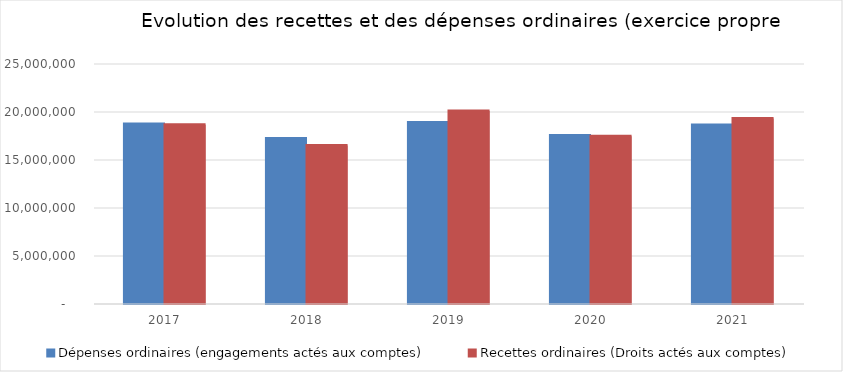
| Category | Dépenses ordinaires (engagements actés aux comptes) | Recettes ordinaires (Droits actés aux comptes) |
|---|---|---|
| 2017.0 | 18752855.6 | 18684102.08 |
| 2018.0 | 17250242.96 | 16512373.5 |
| 2019.0 | 18918446.98 | 20104837.39 |
| 2020.0 | 17554108.51 | 17469001.07 |
| 2021.0 | 18638783.39 | 19314026.27 |